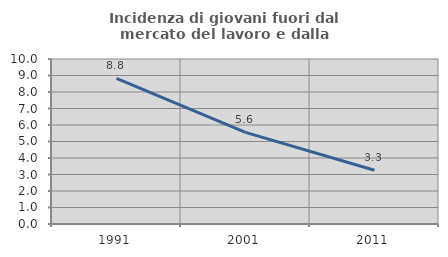
| Category | Incidenza di giovani fuori dal mercato del lavoro e dalla formazione  |
|---|---|
| 1991.0 | 8.824 |
| 2001.0 | 5.556 |
| 2011.0 | 3.261 |